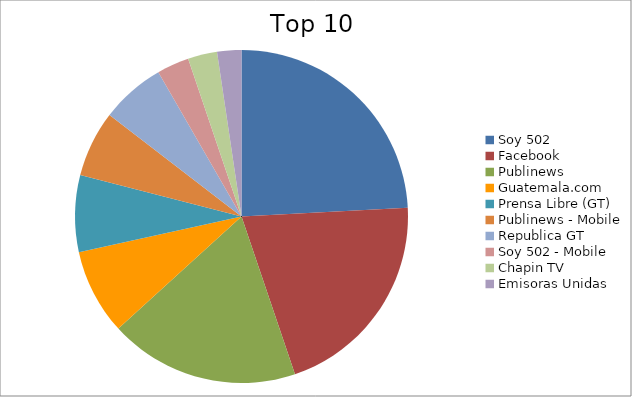
| Category | Series 0 |
|---|---|
| Soy 502 | 16.44 |
| Facebook | 14.03 |
| Publinews | 12.55 |
| Guatemala.com | 5.66 |
| Prensa Libre (GT) | 5.06 |
| Publinews - Mobile | 4.37 |
| Republica GT | 4.25 |
| Soy 502 - Mobile | 2.13 |
| Chapin TV | 1.93 |
| Emisoras Unidas | 1.6 |